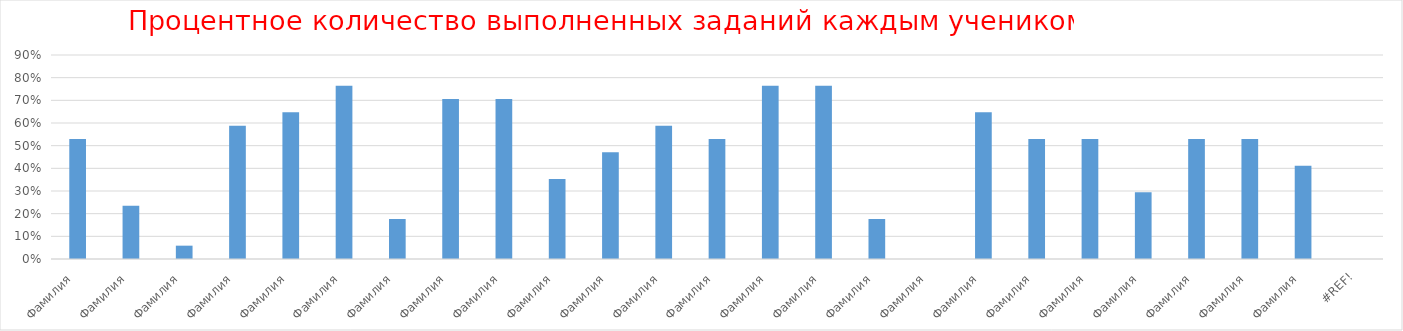
| Category | Series 0 |
|---|---|
| Фамилия  | 0.529 |
| Фамилия  | 0.235 |
| Фамилия  | 0.059 |
| Фамилия  | 0.588 |
| Фамилия  | 0.647 |
| Фамилия  | 0.765 |
| Фамилия  | 0.176 |
| Фамилия  | 0.706 |
| Фамилия  | 0.706 |
| Фамилия  | 0.353 |
| Фамилия  | 0.471 |
| Фамилия  | 0.588 |
| Фамилия  | 0.529 |
| Фамилия  | 0.765 |
| Фамилия  | 0.765 |
| Фамилия  | 0.176 |
| Фамилия  | 0 |
| Фамилия  | 0.647 |
| Фамилия  | 0.529 |
| Фамилия  | 0.529 |
| Фамилия  | 0.294 |
| Фамилия  | 0.529 |
| Фамилия  | 0.529 |
| Фамилия  | 0.412 |
| #ССЫЛКА! | 0 |